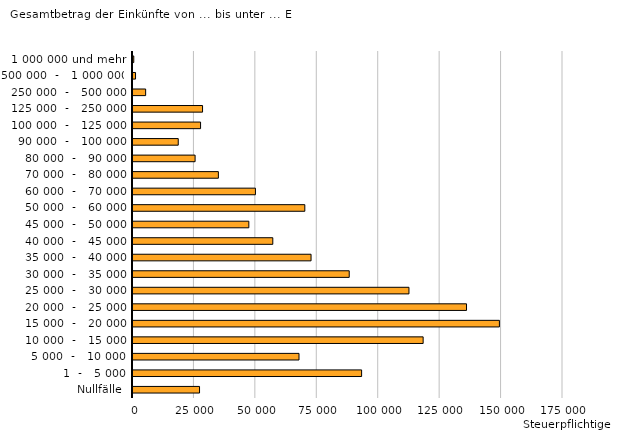
| Category | Steuerpflichtige |
|---|---|
| Nullfälle | 27077 |
|   1  -   5 000 | 93040 |
| 5 000  -   10 000 | 67561 |
| 10 000  -   15 000 | 118083 |
| 15 000  -   20 000 | 149123 |
| 20 000  -   25 000 | 135738 |
| 25 000  -   30 000 | 112309 |
| 30 000  -   35 000 | 88001 |
| 35 000  -   40 000 | 72464 |
| 40 000  -   45 000 | 56900 |
| 45 000  -   50 000 | 47143 |
| 50 000  -   60 000 | 69925 |
| 60 000  -   70 000 | 49829 |
| 70 000  -   80 000 | 34748 |
| 80 000  -   90 000 | 25272 |
| 90 000  -   100 000 | 18413 |
| 100 000  -   125 000 | 27499 |
| 125 000  -   250 000 | 28307 |
| 250 000  -   500 000 | 5147 |
| 500 000  -   1 000 000 | 1031 |
| 1 000 000 und mehr | 316 |